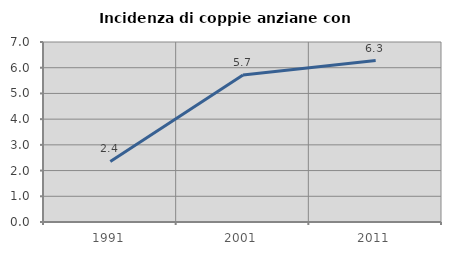
| Category | Incidenza di coppie anziane con figli |
|---|---|
| 1991.0 | 2.353 |
| 2001.0 | 5.714 |
| 2011.0 | 6.278 |